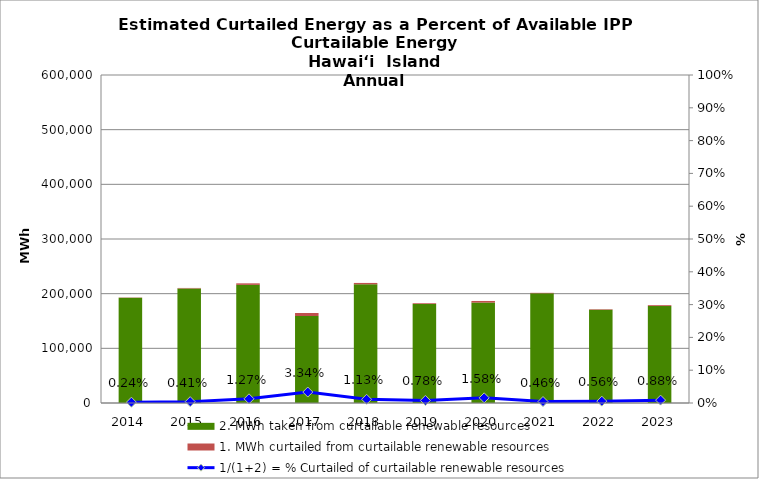
| Category | 2. MWh taken from curtailable renewable resources | 1. MWh curtailed from curtailable renewable resources |
|---|---|---|
| 2014.0 | 192465.802 | 467.979 |
| 2015.0 | 209595.357 | 862.42 |
| 2016.0 | 216088.171 | 2790.609 |
| 2017.0 | 159160.26 | 5505.755 |
| 2018.0 | 217153.319 | 2478.722 |
| 2019.0 | 181038.236 | 1425.862 |
| 2020.0 | 183700.619 | 2948.849 |
| 2021.0 | 200615.735 | 917.19 |
| 2022.0 | 170379.751 | 968 |
| 2023.0 | 177360.12 | 1566.421 |